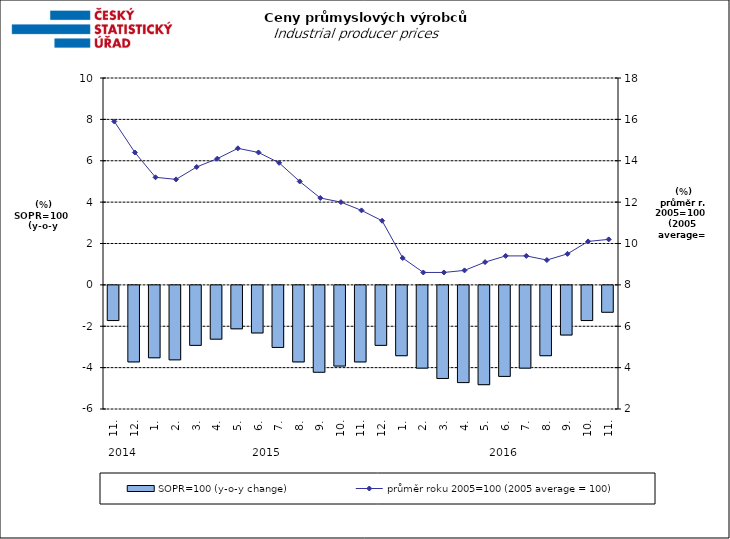
| Category | SOPR=100 (y-o-y change)   |
|---|---|
| 0 | -1.7 |
| 1 | -3.7 |
| 2 | -3.5 |
| 3 | -3.6 |
| 4 | -2.9 |
| 5 | -2.6 |
| 6 | -2.1 |
| 7 | -2.3 |
| 8 | -3 |
| 9 | -3.7 |
| 10 | -4.2 |
| 11 | -3.9 |
| 12 | -3.7 |
| 13 | -2.9 |
| 14 | -3.4 |
| 15 | -4 |
| 16 | -4.5 |
| 17 | -4.7 |
| 18 | -4.8 |
| 19 | -4.4 |
| 20 | -4 |
| 21 | -3.4 |
| 22 | -2.4 |
| 23 | -1.7 |
| 24 | -1.3 |